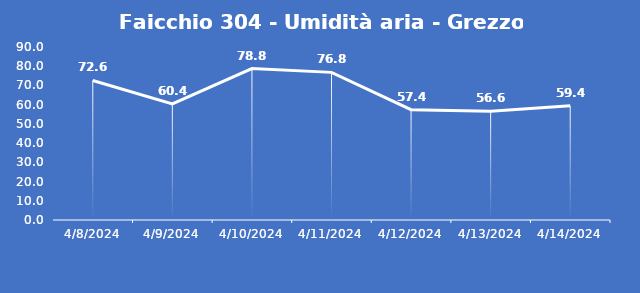
| Category | Faicchio 304 - Umidità aria - Grezzo (%) |
|---|---|
| 4/8/24 | 72.6 |
| 4/9/24 | 60.4 |
| 4/10/24 | 78.8 |
| 4/11/24 | 76.8 |
| 4/12/24 | 57.4 |
| 4/13/24 | 56.6 |
| 4/14/24 | 59.4 |